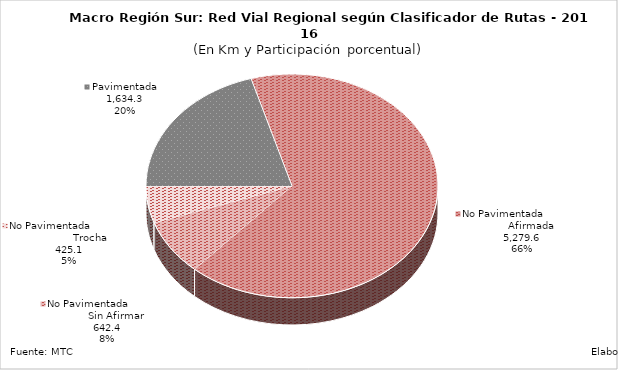
| Category | Series 0 |
|---|---|
| Pavimentada | 1634.296 |
| No Pavimentada                   Afirmada | 5279.622 |
| No Pavimentada                   Sin Afirmar | 642.378 |
| No Pavimentada                            Trocha | 425.112 |